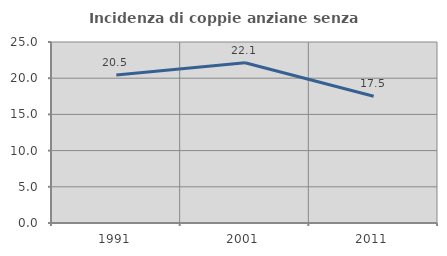
| Category | Incidenza di coppie anziane senza figli  |
|---|---|
| 1991.0 | 20.455 |
| 2001.0 | 22.137 |
| 2011.0 | 17.5 |